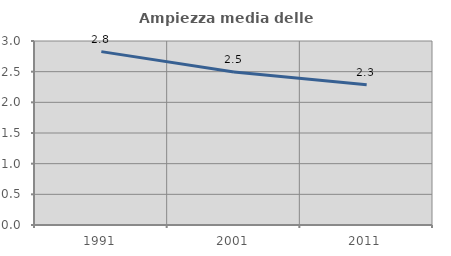
| Category | Ampiezza media delle famiglie |
|---|---|
| 1991.0 | 2.827 |
| 2001.0 | 2.495 |
| 2011.0 | 2.288 |